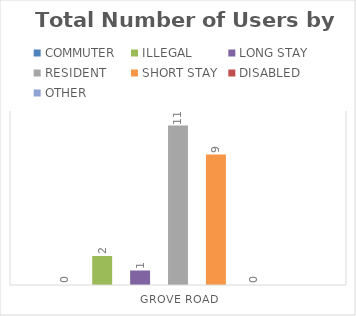
| Category | COMMUTER | ILLEGAL | LONG STAY | RESIDENT | SHORT STAY | DISABLED | OTHER |
|---|---|---|---|---|---|---|---|
| GROVE ROAD | 0 | 2 | 1 | 11 | 9 | 0 | 0 |